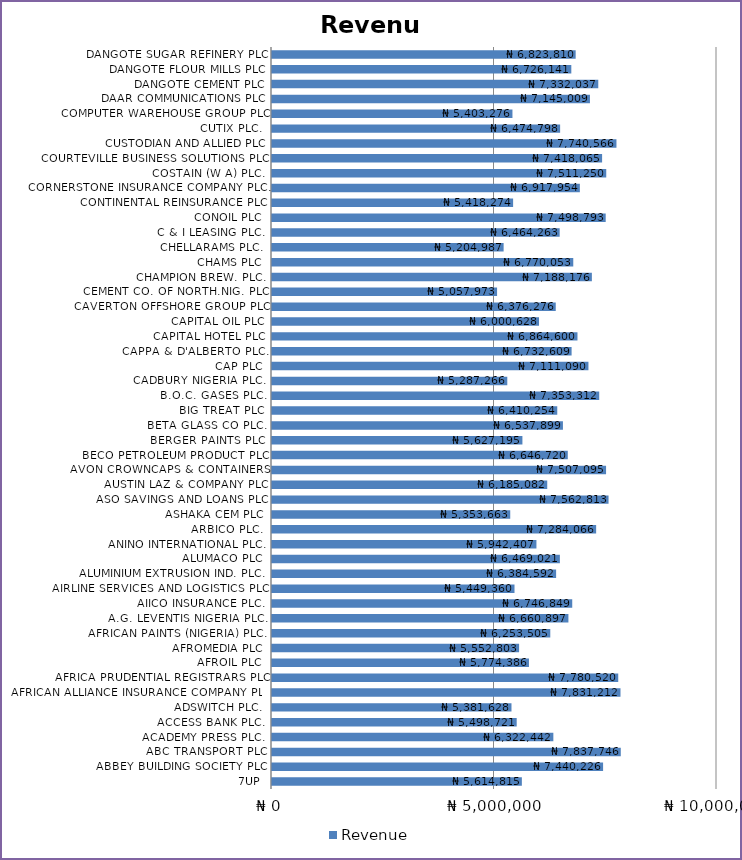
| Category | Revenue |
|---|---|
| 7UP | 5614815 |
| ABBEY BUILDING SOCIETY PLC | 7440226 |
| ABC TRANSPORT PLC | 7837746 |
| ACADEMY PRESS PLC. | 6322442 |
| ACCESS BANK PLC. | 5498721 |
| ADSWITCH PLC. | 5381628 |
| AFRICAN ALLIANCE INSURANCE COMPANY PLC | 7831212 |
| AFRICA PRUDENTIAL REGISTRARS PLC | 7780520 |
| AFROIL PLC | 5774386 |
| AFROMEDIA PLC | 5552803 |
| AFRICAN PAINTS (NIGERIA) PLC. | 6253505 |
| A.G. LEVENTIS NIGERIA PLC. | 6660897 |
| AIICO INSURANCE PLC. | 6746849 |
| AIRLINE SERVICES AND LOGISTICS PLC | 5449360 |
| ALUMINIUM EXTRUSION IND. PLC. | 6384592 |
| ALUMACO PLC | 6469021 |
| ANINO INTERNATIONAL PLC. | 5942407 |
| ARBICO PLC. | 7284066 |
| ASHAKA CEM PLC | 5353663 |
| ASO SAVINGS AND LOANS PLC | 7562813 |
| AUSTIN LAZ & COMPANY PLC | 6185082 |
| AVON CROWNCAPS & CONTAINERS | 7507095 |
| BECO PETROLEUM PRODUCT PLC | 6646720 |
| BERGER PAINTS PLC | 5627195 |
| BETA GLASS CO PLC. | 6537899 |
| BIG TREAT PLC | 6410254 |
| B.O.C. GASES PLC. | 7353312 |
| CADBURY NIGERIA PLC. | 5287266 |
| CAP PLC | 7111090 |
| CAPPA & D'ALBERTO PLC. | 6732609 |
| CAPITAL HOTEL PLC | 6864600 |
| CAPITAL OIL PLC | 6000628 |
| CAVERTON OFFSHORE GROUP PLC | 6376276 |
| CEMENT CO. OF NORTH.NIG. PLC | 5057973 |
| CHAMPION BREW. PLC. | 7188176 |
| CHAMS PLC | 6770053 |
| CHELLARAMS PLC. | 5204987 |
| C & I LEASING PLC. | 6464263 |
| CONOIL PLC | 7498793 |
| CONTINENTAL REINSURANCE PLC | 5418274 |
| CORNERSTONE INSURANCE COMPANY PLC. | 6917954 |
| COSTAIN (W A) PLC. | 7511250 |
| COURTEVILLE BUSINESS SOLUTIONS PLC | 7418065 |
| CUSTODIAN AND ALLIED PLC | 7740566 |
| CUTIX PLC. | 6474798 |
| COMPUTER WAREHOUSE GROUP PLC | 5403276 |
| DAAR COMMUNICATIONS PLC | 7145009 |
| DANGOTE CEMENT PLC | 7332037 |
| DANGOTE FLOUR MILLS PLC | 6726141 |
| DANGOTE SUGAR REFINERY PLC | 6823810 |